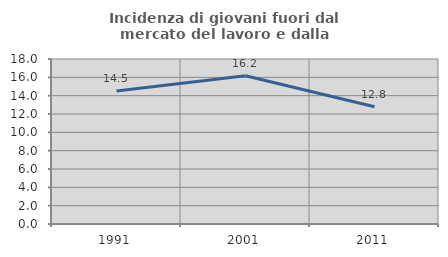
| Category | Incidenza di giovani fuori dal mercato del lavoro e dalla formazione  |
|---|---|
| 1991.0 | 14.516 |
| 2001.0 | 16.174 |
| 2011.0 | 12.791 |